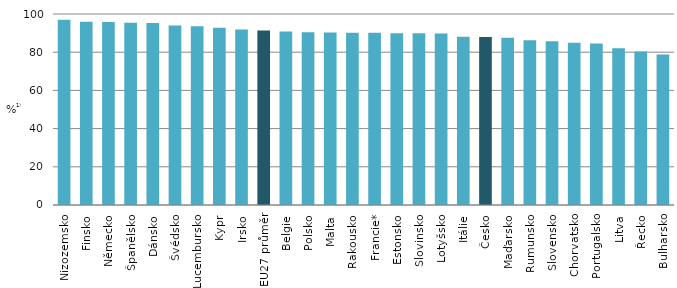
| Category | sdfs |
|---|---|
| Nizozemsko | 96.953 |
| Finsko | 95.999 |
| Německo | 95.795 |
| Španělsko | 95.378 |
| Dánsko | 95.272 |
| Švédsko | 93.941 |
| Lucembursko | 93.573 |
| Kypr | 92.776 |
| Irsko | 91.823 |
| EU27 průměr | 91.302 |
| Belgie | 90.861 |
| Polsko | 90.384 |
| Malta | 90.362 |
| Rakousko | 90.242 |
| Francie* | 90.173 |
| Estonsko | 89.977 |
| Slovinsko | 89.975 |
| Lotyšsko | 89.728 |
| Itálie | 88.103 |
| Česko | 88.02 |
| Maďarsko | 87.631 |
| Rumunsko | 86.24 |
| Slovensko | 85.779 |
| Chorvatsko | 84.999 |
| Portugalsko | 84.493 |
| Litva | 82.131 |
| Řecko | 80.382 |
| Bulharsko | 78.85 |